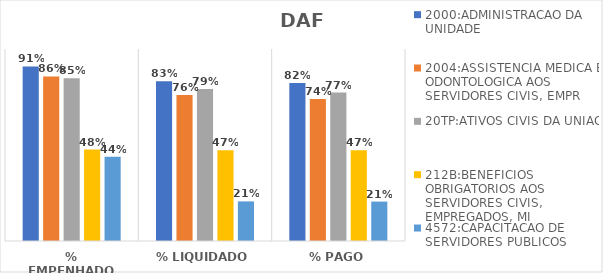
| Category | 2000:ADMINISTRACAO DA UNIDADE | 2004:ASSISTENCIA MEDICA E ODONTOLOGICA AOS SERVIDORES CIVIS, EMPR | 20TP:ATIVOS CIVIS DA UNIAO | 212B:BENEFICIOS OBRIGATORIOS AOS SERVIDORES CIVIS, EMPREGADOS, MI | 4572:CAPACITACAO DE SERVIDORES PUBLICOS FEDERAIS EM PROCESSO DE Q |
|---|---|---|---|---|---|
| % EMPENHADO | 0.909 | 0.857 | 0.848 | 0.476 | 0.439 |
| % LIQUIDADO | 0.833 | 0.761 | 0.792 | 0.473 | 0.206 |
| % PAGO | 0.823 | 0.739 | 0.773 | 0.472 | 0.205 |